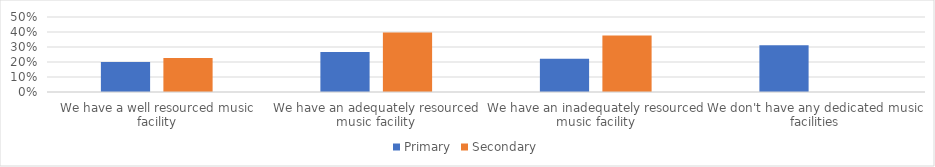
| Category | Primary | Secondary |
|---|---|---|
| We have a well resourced music facility | 0.2 | 0.226 |
| We have an adequately resourced music facility | 0.267 | 0.396 |
| We have an inadequately resourced music facility | 0.222 | 0.377 |
| We don't have any dedicated music facilities | 0.311 | 0 |